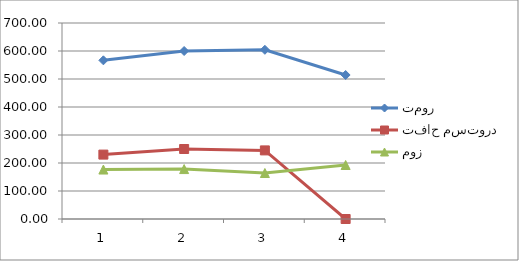
| Category | تمور | تفاح مستورد | موز |
|---|---|---|---|
| 0 | 566.667 | 230 | 176.667 |
| 1 | 600 | 250 | 178.333 |
| 2 | 604.286 | 245 | 164.286 |
| 3 | 514.286 | 0 | 192.857 |